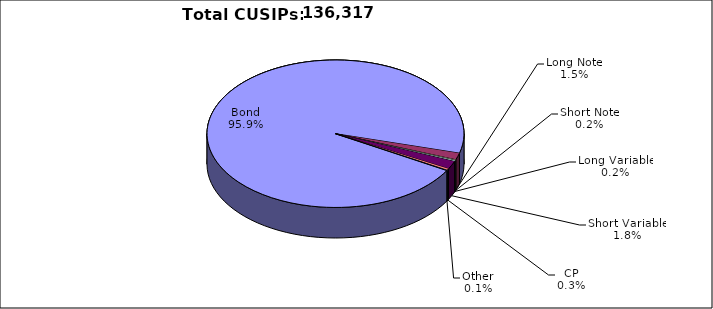
| Category | CUSIPs |
|---|---|
| Bond | 130745 |
| Long Note | 2030 |
| Short Note | 212 |
| Long Variable | 328 |
| Short Variable | 2405 |
| CP | 472 |
| Other | 125 |